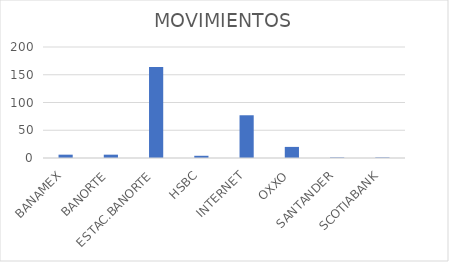
| Category | MOVIMIENTOS |
|---|---|
| BANAMEX | 6 |
| BANORTE | 6 |
| ESTAC.BANORTE | 164 |
| HSBC | 4 |
| INTERNET | 77 |
| OXXO | 20 |
| SANTANDER | 1 |
| SCOTIABANK | 1 |